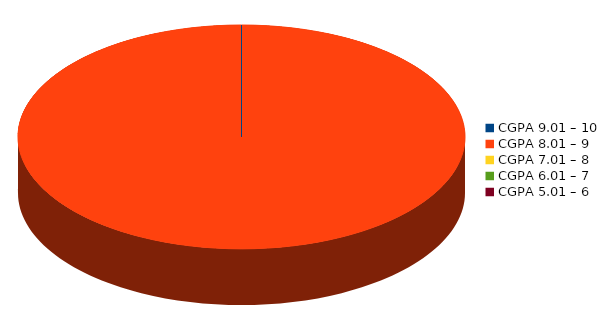
| Category | Number of students |
|---|---|
| CGPA 9.01 – 10 | 0 |
| CGPA 8.01 – 9 | 19 |
| CGPA 7.01 – 8 | 0 |
| CGPA 6.01 – 7 | 0 |
| CGPA 5.01 – 6 | 0 |